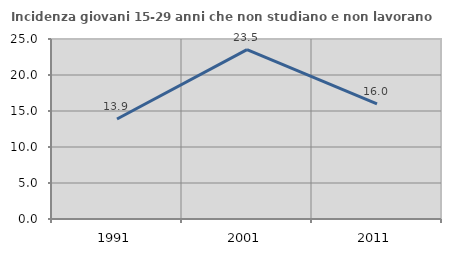
| Category | Incidenza giovani 15-29 anni che non studiano e non lavorano  |
|---|---|
| 1991.0 | 13.892 |
| 2001.0 | 23.529 |
| 2011.0 | 16 |